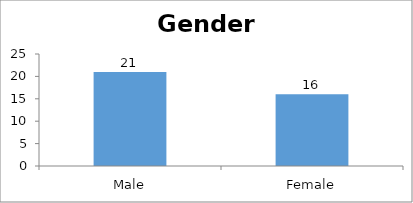
| Category | Gender |
|---|---|
| Male | 21 |
| Female | 16 |